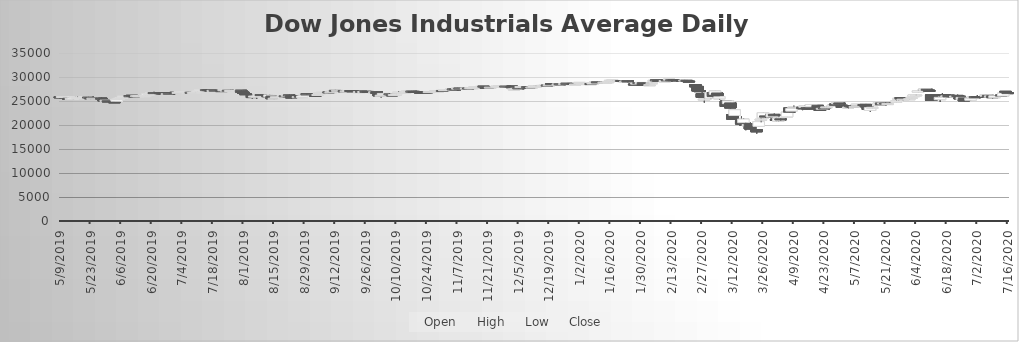
| Category | Open | High | Low | Close |
|---|---|---|---|---|
| 5/9/19 | 25878.85 | 25884.89 | 25517.39 | 25828.36 |
| 5/10/19 | 25763.72 | 26019.32 | 25469.86 | 25942.37 |
| 5/13/19 | 25568.06 | 25568.06 | 25222.51 | 25324.99 |
| 5/14/19 | 25384.03 | 25688.96 | 25384.03 | 25532.05 |
| 5/15/19 | 25400.13 | 25724.89 | 25341.94 | 25648.02 |
| 5/16/19 | 25692.14 | 25957.63 | 25692.14 | 25862.68 |
| 5/17/19 | 25719.95 | 25948.74 | 25657.78 | 25764 |
| 5/20/19 | 25655.31 | 25751.71 | 25560.55 | 25679.9 |
| 5/21/19 | 25782.34 | 25898.27 | 25779.61 | 25877.33 |
| 5/22/19 | 25818.46 | 25878.21 | 25755.11 | 25776.61 |
| 5/23/19 | 25657.99 | 25657.99 | 25328.09 | 25490.47 |
| 5/24/19 | 25551.07 | 25670.81 | 25496.2 | 25585.69 |
| 5/28/19 | 25616.55 | 25717.63 | 25346 | 25347.77 |
| 5/29/19 | 25231.46 | 25231.46 | 24938.24 | 25126.41 |
| 5/30/19 | 25139.94 | 25218.54 | 25066.75 | 25169.88 |
| 5/31/19 | 25046.31 | 25046.31 | 24812.87 | 24815.04 |
| 6/3/19 | 24830.16 | 24935.21 | 24680.57 | 24819.78 |
| 6/4/19 | 24962.82 | 25343.77 | 24962.82 | 25332.18 |
| 6/5/19 | 25451 | 25544.66 | 25373.58 | 25539.57 |
| 6/6/19 | 25567.45 | 25800.3 | 25518.05 | 25720.66 |
| 6/7/19 | 25768.72 | 26072.75 | 25768.72 | 25983.94 |
| 6/10/19 | 26090.22 | 26210.61 | 26054.31 | 26062.68 |
| 6/11/19 | 26180.59 | 26248.67 | 25998.87 | 26048.51 |
| 6/12/19 | 26040.3 | 26082.1 | 25958.66 | 26004.83 |
| 6/13/19 | 26036.94 | 26146.91 | 25995.71 | 26106.77 |
| 6/14/19 | 26076.36 | 26162.28 | 25988.09 | 26089.61 |
| 6/17/19 | 26108.53 | 26165.78 | 26049.8 | 26112.53 |
| 6/18/19 | 26228.88 | 26527.19 | 26227.76 | 26465.54 |
| 6/19/19 | 26490.16 | 26569.75 | 26415.05 | 26504 |
| 6/20/19 | 26665.38 | 26798.63 | 26539.69 | 26753.17 |
| 6/21/19 | 26749.12 | 26907.37 | 26706.4 | 26719.13 |
| 6/24/19 | 26727.61 | 26806.52 | 26723.37 | 26727.54 |
| 6/25/19 | 26731.61 | 26752.31 | 26527.66 | 26548.22 |
| 6/26/19 | 26599.42 | 26660.04 | 26536.33 | 26536.82 |
| 6/27/19 | 26523.72 | 26607.24 | 26465.32 | 26526.58 |
| 6/28/19 | 26605.93 | 26638.35 | 26522.27 | 26599.96 |
| 7/1/19 | 26805.86 | 26890.64 | 26616.21 | 26717.43 |
| 7/2/19 | 26719.53 | 26787.56 | 26632.65 | 26786.68 |
| 7/3/19 | 26832.32 | 26966 | 26831.44 | 26966 |
| 7/5/19 | 26867.75 | 26950.81 | 26733.33 | 26922.12 |
| 7/8/19 | 26835.64 | 26839.14 | 26744.87 | 26806.14 |
| 7/9/19 | 26725.12 | 26807.7 | 26665.57 | 26783.49 |
| 7/10/19 | 26851.96 | 26983.45 | 26813.11 | 26860.2 |
| 7/11/19 | 26950.16 | 27088.45 | 26916.32 | 27088.08 |
| 7/12/19 | 27139.49 | 27333.79 | 27135.45 | 27332.03 |
| 7/15/19 | 27364.69 | 27364.69 | 27294.17 | 27359.16 |
| 7/16/19 | 27349.32 | 27398.68 | 27290.24 | 27335.63 |
| 7/17/19 | 27320.91 | 27343.06 | 27218.38 | 27219.85 |
| 7/18/19 | 27191.98 | 27266.81 | 27068.79 | 27222.97 |
| 7/19/19 | 27246.38 | 27342.96 | 27145.78 | 27154.2 |
| 7/22/19 | 27174.18 | 27227.77 | 27088.9 | 27171.9 |
| 7/23/19 | 27231.86 | 27368.81 | 27204.58 | 27349.19 |
| 7/24/19 | 27262.24 | 27291.04 | 27191.12 | 27269.97 |
| 7/25/19 | 27247.39 | 27298.43 | 27062.48 | 27140.98 |
| 7/26/19 | 27166 | 27213.7 | 27123.25 | 27192.45 |
| 7/29/19 | 27192.24 | 27275.85 | 27178.06 | 27221.35 |
| 7/30/19 | 27145.39 | 27224.36 | 27069.86 | 27198.02 |
| 7/31/19 | 27244.67 | 27281.65 | 26719.6 | 26864.27 |
| 8/1/19 | 26879.86 | 27175.59 | 26548.71 | 26583.42 |
| 8/2/19 | 26528.66 | 26570.02 | 26249.22 | 26485.01 |
| 8/5/19 | 26259.23 | 26259.23 | 25523.38 | 25717.74 |
| 8/6/19 | 25810.62 | 26038.68 | 25710.87 | 26029.52 |
| 8/7/19 | 25814.22 | 26073.21 | 25440.39 | 26007.07 |
| 8/8/19 | 26086.52 | 26383.61 | 26038.23 | 26378.19 |
| 8/9/19 | 26337.09 | 26413.36 | 26097.64 | 26287.44 |
| 8/12/19 | 26169.91 | 26178.95 | 25824.94 | 25897.71 |
| 8/13/19 | 25888.88 | 26426.97 | 25833.25 | 26279.91 |
| 8/14/19 | 26035.08 | 26035.08 | 25471.59 | 25479.42 |
| 8/15/19 | 25514.25 | 25639.69 | 25339.6 | 25579.39 |
| 8/16/19 | 25678.17 | 25929.65 | 25678.17 | 25886.01 |
| 8/19/19 | 26020.06 | 26222.32 | 26020.06 | 26135.79 |
| 8/20/19 | 26086.86 | 26160.12 | 25952 | 25962.44 |
| 8/21/19 | 26145.36 | 26268.32 | 26141.77 | 26202.73 |
| 8/22/19 | 26271.64 | 26388.78 | 26099.01 | 26252.24 |
| 8/23/19 | 26134.21 | 26320.29 | 25507.18 | 25628.9 |
| 8/26/19 | 25826.05 | 25941.25 | 25716.39 | 25898.83 |
| 8/27/19 | 26014.46 | 26054.02 | 25721.85 | 25777.9 |
| 8/28/19 | 25712.99 | 26041.57 | 25637.43 | 26036.1 |
| 8/29/19 | 26249.09 | 26408.84 | 26185.85 | 26362.25 |
| 8/30/19 | 26476.39 | 26514.62 | 26295.59 | 26403.28 |
| 9/3/19 | 26198.26 | 26198.26 | 25978.22 | 26118.02 |
| 9/4/19 | 26301.99 | 26362.35 | 26244.44 | 26355.47 |
| 9/5/19 | 26603.15 | 26836.3 | 26603.15 | 26728.15 |
| 9/6/19 | 26790.25 | 26860.87 | 26708.39 | 26797.46 |
| 9/9/19 | 26866.23 | 26900.83 | 26762.18 | 26835.51 |
| 9/10/19 | 26805.83 | 26909.43 | 26717.05 | 26909.43 |
| 9/11/19 | 26928.05 | 27137.04 | 26885.48 | 27137.04 |
| 9/12/19 | 27197.32 | 27306.73 | 27105.01 | 27182.45 |
| 9/13/19 | 27216.67 | 27277.55 | 27193.95 | 27219.52 |
| 9/16/19 | 27146.06 | 27172.87 | 27032.56 | 27076.82 |
| 9/17/19 | 27010.12 | 27110.8 | 26987.14 | 27110.8 |
| 9/18/19 | 27075.39 | 27161.93 | 26899.15 | 27147.08 |
| 9/19/19 | 27186.05 | 27272.17 | 27064.21 | 27094.79 |
| 9/20/19 | 27102.18 | 27194.75 | 26926.68 | 26935.07 |
| 9/23/19 | 26851.45 | 27011.07 | 26831.34 | 26949.99 |
| 9/24/19 | 27034.07 | 27079.68 | 26704.96 | 26807.77 |
| 9/25/19 | 26866.71 | 27016.56 | 26755.86 | 26970.71 |
| 9/26/19 | 27004.11 | 27015.07 | 26803.84 | 26891.12 |
| 9/27/19 | 26987.26 | 27012.54 | 26715.82 | 26820.25 |
| 9/30/19 | 26852.33 | 26998.86 | 26852.33 | 26916.83 |
| 10/1/19 | 26962.54 | 27046.21 | 26562.22 | 26573.04 |
| 10/2/19 | 26425.86 | 26438.04 | 25974.12 | 26078.62 |
| 10/3/19 | 26039.02 | 26205.2 | 25743.46 | 26201.04 |
| 10/4/19 | 26271.7 | 26590.74 | 26271.7 | 26573.72 |
| 10/7/19 | 26502.33 | 26655.84 | 26424.54 | 26478.02 |
| 10/8/19 | 26276.59 | 26421.81 | 26139.8 | 26164.04 |
| 10/9/19 | 26308.23 | 26424.31 | 26249.75 | 26346.01 |
| 10/10/19 | 26317.35 | 26603.31 | 26314.51 | 26496.67 |
| 10/11/19 | 26694.2 | 27013.97 | 26694.2 | 26816.59 |
| 10/14/19 | 26766.43 | 26874.33 | 26749.18 | 26787.36 |
| 10/15/19 | 26811.2 | 27120.11 | 26811.2 | 27024.8 |
| 10/16/19 | 26972.31 | 27058.34 | 26943.29 | 27001.98 |
| 10/17/19 | 27032.38 | 27112.16 | 26970.29 | 27025.88 |
| 10/18/19 | 27004.49 | 27018.25 | 26770.13 | 26770.2 |
| 10/21/19 | 26852.67 | 26852.67 | 26747.62 | 26827.64 |
| 10/22/19 | 26850.43 | 26946.64 | 26788.1 | 26788.1 |
| 10/23/19 | 26835.24 | 26896.89 | 26745 | 26833.95 |
| 10/24/19 | 26893.93 | 26931.78 | 26714.34 | 26805.53 |
| 10/25/19 | 26789.61 | 27015.37 | 26765.68 | 26958.06 |
| 10/28/19 | 27040.33 | 27167.88 | 27028.71 | 27090.72 |
| 10/29/19 | 27061.07 | 27165.94 | 27039.76 | 27071.42 |
| 10/30/19 | 27110.71 | 27204.36 | 27019.63 | 27186.69 |
| 10/31/19 | 27188.37 | 27188.37 | 26918.29 | 27046.23 |
| 11/1/19 | 27142.95 | 27347.43 | 27142.95 | 27347.36 |
| 11/4/19 | 27402.06 | 27517.58 | 27402.06 | 27462.11 |
| 11/5/19 | 27500.23 | 27558.29 | 27453.55 | 27492.63 |
| 11/6/19 | 27502.74 | 27526.05 | 27407.81 | 27492.56 |
| 11/7/19 | 27590.16 | 27774.06 | 27590.16 | 27674.8 |
| 11/8/19 | 27686.2 | 27694.95 | 27579.09 | 27681.24 |
| 11/11/19 | 27580.66 | 27714.39 | 27517.67 | 27691.49 |
| 11/12/19 | 27701.59 | 27770.86 | 27635.32 | 27691.49 |
| 11/13/19 | 27622.04 | 27806.4 | 27587.2 | 27783.59 |
| 11/14/19 | 27757.2 | 27800.71 | 27676.97 | 27781.96 |
| 11/15/19 | 27843.54 | 28004.89 | 27843.54 | 28004.89 |
| 11/18/19 | 27993.22 | 28040.97 | 27969.24 | 28036.22 |
| 11/19/19 | 28079.76 | 28090.21 | 27894.52 | 27934.02 |
| 11/20/19 | 27879.55 | 27897.28 | 27675.28 | 27821.09 |
| 11/21/19 | 27820.28 | 27828.33 | 27708.34 | 27766.29 |
| 11/22/19 | 27831.23 | 27898.46 | 27773.98 | 27875.62 |
| 11/25/19 | 27917.77 | 28068.69 | 27917.77 | 28066.47 |
| 11/26/19 | 28080.75 | 28146.02 | 28042.21 | 28121.68 |
| 11/27/19 | 28156.47 | 28174.97 | 28075.23 | 28164 |
| 11/29/19 | 28103.16 | 28119.51 | 28042.53 | 28051.41 |
| 12/2/19 | 28109.74 | 28109.84 | 27782.35 | 27783.04 |
| 12/3/19 | 27501.98 | 27524.74 | 27325.13 | 27502.81 |
| 12/4/19 | 27634.63 | 27727.45 | 27612.08 | 27649.78 |
| 12/5/19 | 27736.05 | 27745.2 | 27562.8 | 27677.79 |
| 12/6/19 | 27839.68 | 28035.85 | 27839.68 | 28015.06 |
| 12/9/19 | 27987.05 | 28010.42 | 27906.14 | 27909.6 |
| 12/10/19 | 27900.65 | 27949.02 | 27804 | 27881.72 |
| 12/11/19 | 27867.31 | 27925.5 | 27801.8 | 27911.3 |
| 12/12/19 | 27898.34 | 28224.95 | 27859.87 | 28132.05 |
| 12/13/19 | 28123.64 | 28290.73 | 28028.32 | 28135.38 |
| 12/16/19 | 28191.67 | 28337.49 | 28191.67 | 28235.89 |
| 12/17/19 | 28221.75 | 28328.63 | 28220.56 | 28267.16 |
| 12/18/19 | 28291.44 | 28323.25 | 28239.28 | 28239.28 |
| 12/19/19 | 28278.31 | 28381.48 | 28278.24 | 28376.96 |
| 12/20/19 | 28608.64 | 28608.64 | 28445.6 | 28455.09 |
| 12/23/19 | 28491.78 | 28582.49 | 28491.78 | 28551.53 |
| 12/24/19 | 28572.57 | 28576.8 | 28503.21 | 28515.45 |
| 12/26/19 | 28539.46 | 28624.1 | 28535.15 | 28621.39 |
| 12/27/19 | 28675.34 | 28701.66 | 28608.98 | 28645.26 |
| 12/30/19 | 28654.76 | 28664.69 | 28428.98 | 28462.14 |
| 12/31/19 | 28414.64 | 28547.35 | 28376.49 | 28538.44 |
| 1/2/20 | 28638.97 | 28872.8 | 28627.77 | 28868.8 |
| 1/3/20 | 28553.33 | 28716.31 | 28500.36 | 28634.88 |
| 1/6/20 | 28465.5 | 28708.02 | 28418.63 | 28703.38 |
| 1/7/20 | 28639.18 | 28685.5 | 28565.28 | 28583.68 |
| 1/8/20 | 28556.14 | 28866.18 | 28522.51 | 28745.09 |
| 1/9/20 | 28851.97 | 28988.01 | 28844.31 | 28956.9 |
| 1/10/20 | 28977.52 | 29009.07 | 28789.1 | 28823.77 |
| 1/13/20 | 28869.01 | 28909.91 | 28819.43 | 28907.05 |
| 1/14/20 | 28895.5 | 29054.16 | 28872.27 | 28939.67 |
| 1/15/20 | 28901.8 | 29127.59 | 28897.35 | 29030.22 |
| 1/16/20 | 29131.95 | 29300.32 | 29131.95 | 29297.64 |
| 1/17/20 | 29313.31 | 29373.62 | 29289.91 | 29348.1 |
| 1/21/20 | 29269.05 | 29341.21 | 29146.47 | 29196.04 |
| 1/22/20 | 29263.63 | 29320.2 | 29172.26 | 29186.27 |
| 1/23/20 | 29111.02 | 29190.47 | 28966.98 | 29160.09 |
| 1/24/20 | 29230.39 | 29288.79 | 28843.31 | 28989.73 |
| 1/27/20 | 28542.49 | 28671.79 | 28449.22 | 28535.8 |
| 1/28/20 | 28594.28 | 28823.23 | 28575.75 | 28722.85 |
| 1/29/20 | 28820.53 | 28944.24 | 28728.19 | 28734.45 |
| 1/30/20 | 28640.16 | 28879.71 | 28489.76 | 28859.44 |
| 1/31/20 | 28813.04 | 28813.04 | 28169.53 | 28256.03 |
| 2/3/20 | 28319.65 | 28630.39 | 28319.65 | 28399.81 |
| 2/4/20 | 28696.74 | 28904.88 | 28696.74 | 28807.63 |
| 2/5/20 | 29048.73 | 29308.89 | 29000.85 | 29290.85 |
| 2/6/20 | 29388.58 | 29408.05 | 29246.93 | 29379.77 |
| 2/7/20 | 29286.92 | 29286.92 | 29056.98 | 29102.51 |
| 2/10/20 | 28995.66 | 29278.07 | 28995.66 | 29276.82 |
| 2/11/20 | 29390.71 | 29415.39 | 29210.47 | 29276.34 |
| 2/12/20 | 29406.75 | 29568.57 | 29406.75 | 29551.42 |
| 2/13/20 | 29436.03 | 29535.4 | 29348.51 | 29423.31 |
| 2/14/20 | 29440.47 | 29463.04 | 29283.18 | 29398.08 |
| 2/18/20 | 29282.78 | 29330.16 | 29116.81 | 29232.19 |
| 2/19/20 | 29312.7 | 29409.09 | 29274.38 | 29348.03 |
| 2/20/20 | 29296.25 | 29368.45 | 28959.65 | 29219.98 |
| 2/21/20 | 29146.53 | 29146.53 | 28892.7 | 28992.41 |
| 2/24/20 | 28402.93 | 28402.93 | 27912.44 | 27960.8 |
| 2/25/20 | 28037.65 | 28134.82 | 26997.62 | 27081.36 |
| 2/26/20 | 27159.46 | 27542.78 | 26890.97 | 26957.59 |
| 2/27/20 | 26526 | 26775.31 | 25752.82 | 25766.64 |
| 2/28/20 | 25270.83 | 25494.24 | 24681.01 | 25409.36 |
| 3/2/20 | 25590.51 | 26706.17 | 25396.9 | 26703.32 |
| 3/3/20 | 26762.47 | 27077.89 | 25706.97 | 25917.41 |
| 3/4/20 | 26383.68 | 27095.5 | 26286.31 | 27090.86 |
| 3/5/20 | 26671.92 | 26671.92 | 25943.33 | 26121.28 |
| 3/6/20 | 25457.21 | 25994.38 | 25229.19 | 25864.78 |
| 3/9/20 | 24992.36 | 24992.36 | 23706.07 | 23851.02 |
| 3/10/20 | 24453 | 25020.99 | 23690.34 | 25018.16 |
| 3/11/20 | 24604.63 | 24604.63 | 23328.32 | 23553.22 |
| 3/12/20 | 22184.71 | 22828.23 | 21176.44 | 21200.62 |
| 3/13/20 | 21973.82 | 23186.3 | 21285.37 | 23185.62 |
| 3/16/20 | 20917.53 | 21768.28 | 20118.16 | 20188.52 |
| 3/17/20 | 20487.05 | 21379.35 | 19882.26 | 21237.38 |
| 3/18/20 | 20188.69 | 20489.33 | 18917.46 | 19898.92 |
| 3/19/20 | 19830.01 | 20442.63 | 19186.82 | 20087.19 |
| 3/20/20 | 20253.15 | 20531.26 | 19094.27 | 19173.98 |
| 3/23/20 | 19028.36 | 19121.01 | 18213.65 | 18591.93 |
| 3/24/20 | 19722.19 | 20729.4 | 19649.25 | 20704.91 |
| 3/25/20 | 21050.34 | 22019.93 | 20538.34 | 21200.55 |
| 3/26/20 | 21468.38 | 22595.06 | 21427.1 | 22552.17 |
| 3/27/20 | 21898.47 | 22327.57 | 21469.27 | 21636.78 |
| 3/30/20 | 21678.22 | 22378.09 | 21522.08 | 22327.48 |
| 3/31/20 | 22208.42 | 22480.37 | 21858.69 | 21917.16 |
| 4/1/20 | 21227.38 | 21487.24 | 20784.43 | 20943.51 |
| 4/2/20 | 20819.46 | 21477.77 | 20735.02 | 21413.44 |
| 4/3/20 | 21285.93 | 21447.81 | 20863.09 | 21052.53 |
| 4/6/20 | 21693.63 | 22783.45 | 21693.63 | 22679.99 |
| 4/7/20 | 23537.44 | 23617.24 | 22634.45 | 22653.86 |
| 4/8/20 | 22893.47 | 23513.4 | 22682.99 | 23433.57 |
| 4/9/20 | 23690.66 | 24008.99 | 23504.09 | 23719.37 |
| 4/13/20 | 23698.93 | 23698.93 | 23095.35 | 23390.77 |
| 4/14/20 | 23690.57 | 24040.58 | 23683.44 | 23949.76 |
| 4/15/20 | 23600.72 | 23649.72 | 23233.32 | 23504.35 |
| 4/16/20 | 23543.66 | 23598.08 | 23211.38 | 23537.68 |
| 4/17/20 | 23817.15 | 24264.21 | 23817.15 | 24242.49 |
| 4/20/20 | 24095.1 | 24108.69 | 23627.19 | 23650.44 |
| 4/21/20 | 23365.25 | 23365.25 | 22941.88 | 23018.88 |
| 4/22/20 | 23437.34 | 23613.1 | 23339.6 | 23475.82 |
| 4/23/20 | 23543.09 | 23885.36 | 23487.86 | 23515.26 |
| 4/24/20 | 23628.24 | 23826 | 23417.68 | 23775.27 |
| 4/27/20 | 23866.15 | 24207.65 | 23840.61 | 24133.78 |
| 4/28/20 | 24357.17 | 24512.24 | 24031.2 | 24101.55 |
| 4/29/20 | 24490.37 | 24764.77 | 24453.99 | 24633.86 |
| 4/30/20 | 24585.57 | 24585.57 | 24186.9 | 24345.72 |
| 5/1/20 | 24120.78 | 24120.78 | 23645.3 | 23723.69 |
| 5/4/20 | 23581.55 | 23769.56 | 23361.16 | 23749.76 |
| 5/5/20 | 23958.88 | 24169.72 | 23868.91 | 23883.09 |
| 5/6/20 | 23978.88 | 24054.59 | 23661.14 | 23664.64 |
| 5/7/20 | 23837.21 | 24094.62 | 23834.39 | 23875.89 |
| 5/8/20 | 24107.82 | 24349.9 | 24107.05 | 24331.32 |
| 5/11/20 | 24256.45 | 24366.21 | 24070.22 | 24221.99 |
| 5/12/20 | 24292.84 | 24382.09 | 23761.58 | 23764.78 |
| 5/13/20 | 23702.16 | 23708.9 | 23067.64 | 23247.97 |
| 5/14/20 | 23049.06 | 23630.86 | 22789.62 | 23625.34 |
| 5/15/20 | 23454.83 | 23730.08 | 23354.15 | 23685.42 |
| 5/18/20 | 24059.98 | 24708.54 | 24059.98 | 24597.37 |
| 5/19/20 | 24577.48 | 24599.5 | 24203.97 | 24206.86 |
| 5/20/20 | 24455.94 | 24649.48 | 24455.94 | 24575.9 |
| 5/21/20 | 24564.27 | 24718.46 | 24370.88 | 24474.12 |
| 5/22/20 | 24461.98 | 24481.64 | 24294.07 | 24465.16 |
| 5/26/20 | 24781.84 | 25176.42 | 24781.84 | 24995.11 |
| 5/27/20 | 25298.63 | 25551.56 | 25009.87 | 25548.27 |
| 5/28/20 | 25697.36 | 25758.79 | 25358.73 | 25400.64 |
| 5/29/20 | 25324.15 | 25482.8 | 25031.67 | 25383.11 |
| 6/1/20 | 25342.99 | 25508.83 | 25220.66 | 25475.02 |
| 6/2/20 | 25582.52 | 25743.13 | 25523.74 | 25742.65 |
| 6/3/20 | 25906.88 | 26337.75 | 25906.88 | 26269.89 |
| 6/4/20 | 26226.49 | 26384.1 | 26082.31 | 26281.82 |
| 6/5/20 | 26836.8 | 27338.3 | 26836.8 | 27110.98 |
| 6/8/20 | 27232.93 | 27580.21 | 27232.48 | 27572.44 |
| 6/9/20 | 27447.37 | 27447.37 | 27151.06 | 27272.3 |
| 6/10/20 | 27251.89 | 27355.22 | 26938.05 | 26989.99 |
| 6/11/20 | 26282.51 | 26294.08 | 25082.72 | 25128.17 |
| 6/12/20 | 25659.42 | 25965.55 | 25078.41 | 25605.54 |
| 6/15/20 | 25270.39 | 25891.58 | 24843.18 | 25763.16 |
| 6/16/20 | 26326.68 | 26611.03 | 25838.56 | 26289.98 |
| 6/17/20 | 26330.52 | 26400.07 | 26068.41 | 26119.61 |
| 6/18/20 | 26016.45 | 26154.2 | 25848.53 | 26080.1 |
| 6/19/20 | 26213.1 | 26451.44 | 25759.66 | 25871.46 |
| 6/22/20 | 25865.08 | 26059.81 | 25667.68 | 26024.96 |
| 6/23/20 | 26159.39 | 26314.97 | 26105.97 | 26156.1 |
| 6/24/20 | 25992.96 | 25992.96 | 25296.73 | 25445.94 |
| 6/25/20 | 25365.22 | 25751.97 | 25209.79 | 25745.6 |
| 6/26/20 | 25641.69 | 25641.69 | 24971.03 | 25015.55 |
| 6/29/20 | 25152.45 | 25601.15 | 25096.16 | 25595.8 |
| 6/30/20 | 25512.43 | 25905.38 | 25475.14 | 25812.88 |
| 7/1/20 | 25879.38 | 26019.31 | 25713.61 | 25734.97 |
| 7/2/20 | 25936.45 | 26204.41 | 25778.12 | 25827.36 |
| 7/6/20 | 25996.08 | 26297.53 | 25996.08 | 26287.03 |
| 7/7/20 | 26172.01 | 26174.93 | 25866.58 | 25890.18 |
| 7/8/20 | 25950.06 | 26109.49 | 25816.25 | 26067.28 |
| 7/9/20 | 26094.92 | 26103.28 | 25526.33 | 25706.09 |
| 7/10/20 | 25690.35 | 26101.32 | 25637.5 | 26075.3 |
| 7/13/20 | 26225.07 | 26639.09 | 26044.23 | 26085.8 |
| 7/14/20 | 26044.17 | 26690.52 | 25994.98 | 26642.59 |
| 7/15/20 | 27009.81 | 27071.33 | 26692.48 | 26870.1 |
| 7/16/20 | 26746.57 | 26879.16 | 26590.01 | 26734.71 |